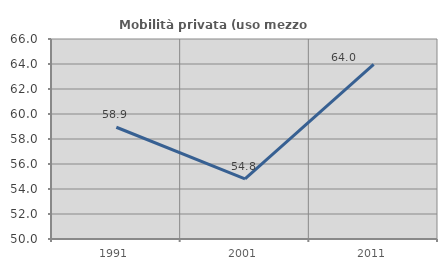
| Category | Mobilità privata (uso mezzo privato) |
|---|---|
| 1991.0 | 58.939 |
| 2001.0 | 54.806 |
| 2011.0 | 63.964 |